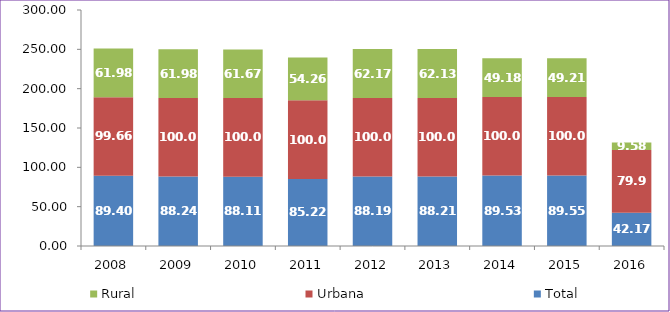
| Category | Total | Urbana | Rural |
|---|---|---|---|
| 2008.0 | 89.4 | 99.66 | 61.98 |
| 2009.0 | 88.24 | 100 | 61.98 |
| 2010.0 | 88.11 | 100 | 61.67 |
| 2011.0 | 85.22 | 100 | 54.26 |
| 2012.0 | 88.19 | 100 | 62.17 |
| 2013.0 | 88.21 | 100 | 62.13 |
| 2014.0 | 89.53 | 100 | 49.18 |
| 2015.0 | 89.55 | 100 | 49.21 |
| 2016.0 | 42.17 | 79.9 | 9.58 |